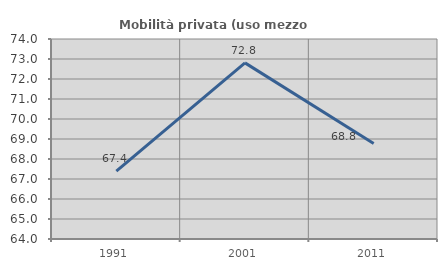
| Category | Mobilità privata (uso mezzo privato) |
|---|---|
| 1991.0 | 67.391 |
| 2001.0 | 72.807 |
| 2011.0 | 68.775 |